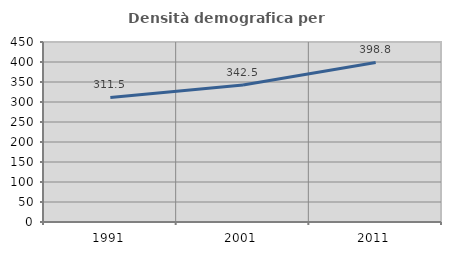
| Category | Densità demografica |
|---|---|
| 1991.0 | 311.53 |
| 2001.0 | 342.48 |
| 2011.0 | 398.754 |